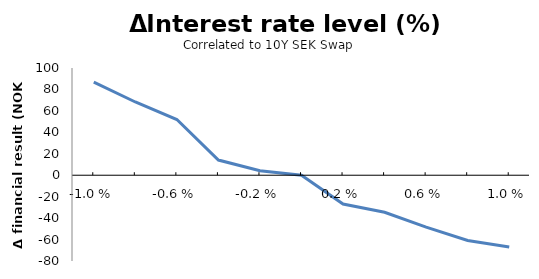
| Category | Series 0 |
|---|---|
| -0.01 | 86.87 |
| -0.008 | 68.307 |
| -0.006 | 51.946 |
| -0.004 | 14.167 |
| -0.002 | 4.16 |
| 0.0 | 0 |
| 0.002 | -26.822 |
| 0.004 | -34.592 |
| 0.006 | -48.38 |
| 0.008 | -60.854 |
| 0.01 | -66.889 |